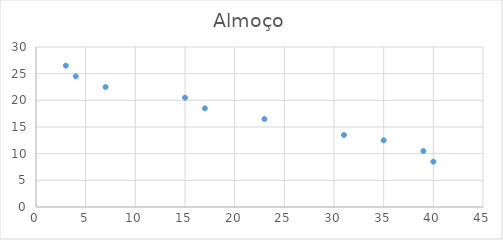
| Category | Almoço |
|---|---|
| 40.0 | 8.5 |
| 39.0 | 10.5 |
| 35.0 | 12.5 |
| 31.0 | 13.5 |
| 23.0 | 16.5 |
| 17.0 | 18.5 |
| 15.0 | 20.5 |
| 7.0 | 22.5 |
| 4.0 | 24.5 |
| 3.0 | 26.5 |